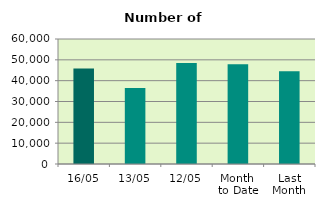
| Category | Series 0 |
|---|---|
| 16/05 | 45790 |
| 13/05 | 36438 |
| 12/05 | 48466 |
| Month 
to Date | 47939.091 |
| Last
Month | 44538 |